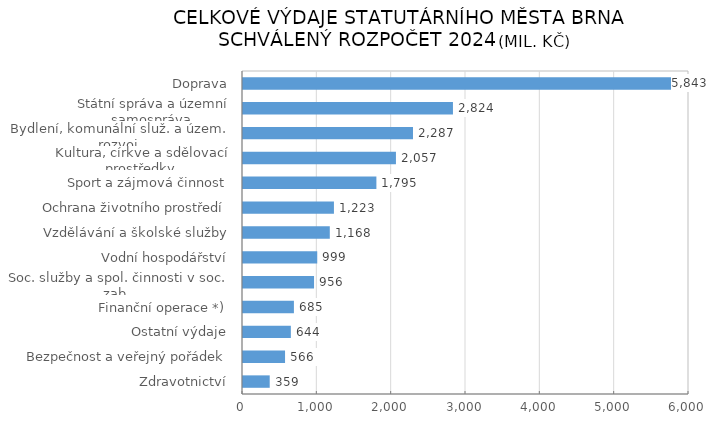
| Category | Series 0 |
|---|---|
|  Zdravotnictví | 359.427 |
|  Bezpečnost a veřejný pořádek | 565.646 |
|  Ostatní výdaje | 643.709 |
|  Finanční operace *) | 684.94 |
|  Soc. služby a spol. činnosti v soc. zab. | 955.756 |
|  Vodní hospodářství | 998.775 |
|  Vzdělávání a školské služby | 1167.712 |
|  Ochrana životního prostředí | 1223.355 |
|  Sport a zájmová činnost | 1794.504 |
|  Kultura, církve a sdělovací prostředky | 2057.469 |
|  Bydlení, komunální služ. a územ. rozvoj | 2286.889 |
|  Státní správa a územní samospráva | 2824.475 |
|  Doprava | 5843.04 |